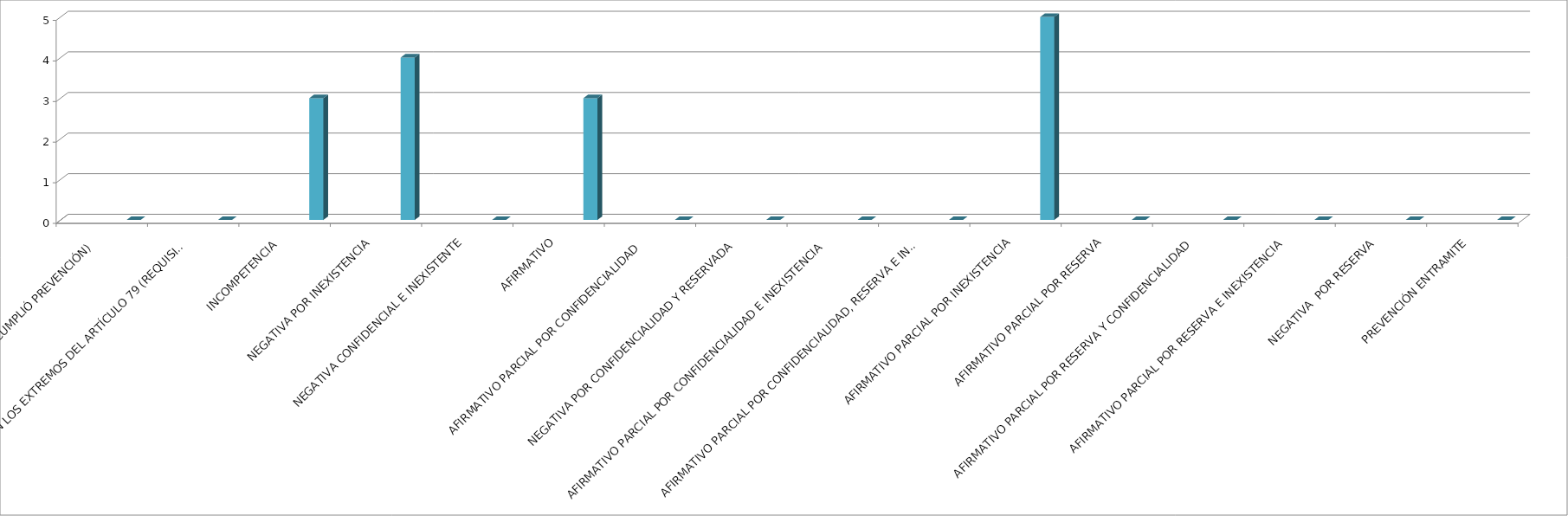
| Category | Series 0 | Series 1 | Series 2 | Series 3 | Series 4 |
|---|---|---|---|---|---|
| SE TIENE POR NO PRESENTADA ( NO CUMPLIÓ PREVENCIÓN) |  |  |  |  | 0 |
| NO CUMPLIO CON LOS EXTREMOS DEL ARTÍCULO 79 (REQUISITOS) |  |  |  |  | 0 |
| INCOMPETENCIA  |  |  |  |  | 3 |
| NEGATIVA POR INEXISTENCIA |  |  |  |  | 4 |
| NEGATIVA CONFIDENCIAL E INEXISTENTE |  |  |  |  | 0 |
| AFIRMATIVO |  |  |  |  | 3 |
| AFIRMATIVO PARCIAL POR CONFIDENCIALIDAD  |  |  |  |  | 0 |
| NEGATIVA POR CONFIDENCIALIDAD Y RESERVADA |  |  |  |  | 0 |
| AFIRMATIVO PARCIAL POR CONFIDENCIALIDAD E INEXISTENCIA |  |  |  |  | 0 |
| AFIRMATIVO PARCIAL POR CONFIDENCIALIDAD, RESERVA E INEXISTENCIA |  |  |  |  | 0 |
| AFIRMATIVO PARCIAL POR INEXISTENCIA |  |  |  |  | 5 |
| AFIRMATIVO PARCIAL POR RESERVA |  |  |  |  | 0 |
| AFIRMATIVO PARCIAL POR RESERVA Y CONFIDENCIALIDAD |  |  |  |  | 0 |
| AFIRMATIVO PARCIAL POR RESERVA E INEXISTENCIA |  |  |  |  | 0 |
| NEGATIVA  POR RESERVA |  |  |  |  | 0 |
| PREVENCIÓN ENTRAMITE |  |  |  |  | 0 |